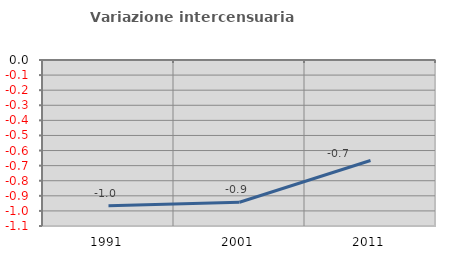
| Category | Variazione intercensuaria annua |
|---|---|
| 1991.0 | -0.965 |
| 2001.0 | -0.943 |
| 2011.0 | -0.666 |